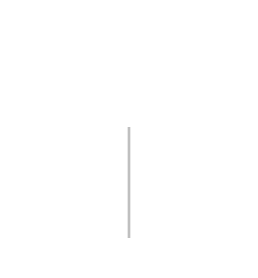
| Category | Positif | Négatif |
|---|---|---|
| 0 | 0 | 0 |
| 1 | 192 | 0 |
| 2 | 192 | -192 |